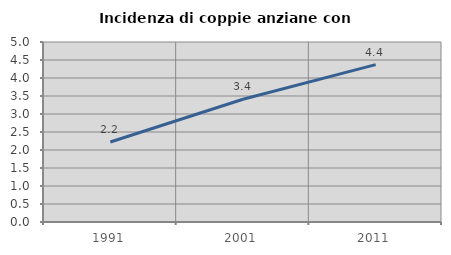
| Category | Incidenza di coppie anziane con figli |
|---|---|
| 1991.0 | 2.222 |
| 2001.0 | 3.409 |
| 2011.0 | 4.372 |